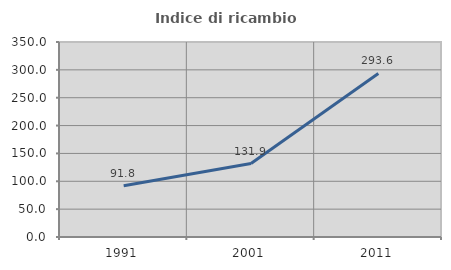
| Category | Indice di ricambio occupazionale  |
|---|---|
| 1991.0 | 91.813 |
| 2001.0 | 131.898 |
| 2011.0 | 293.605 |